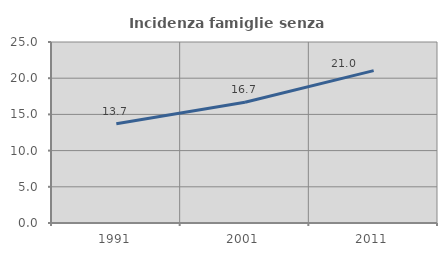
| Category | Incidenza famiglie senza nuclei |
|---|---|
| 1991.0 | 13.717 |
| 2001.0 | 16.689 |
| 2011.0 | 21.043 |